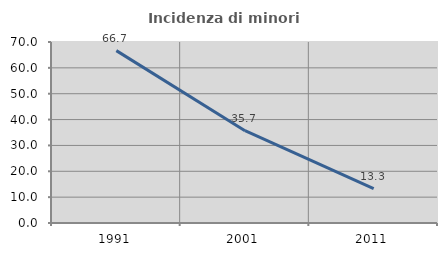
| Category | Incidenza di minori stranieri |
|---|---|
| 1991.0 | 66.667 |
| 2001.0 | 35.714 |
| 2011.0 | 13.333 |